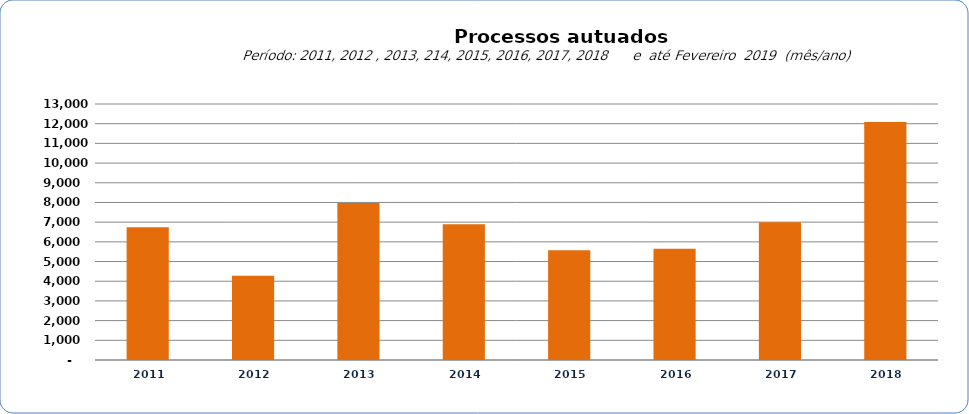
| Category |  6.735  |
|---|---|
| 2011 | 6735 |
| 2012 | 4276 |
| 2013 | 7967 |
| 2014 | 6893 |
| 2015 | 5569 |
| 2016 | 5644 |
| 2017 | 6997 |
| 2018 | 12080 |